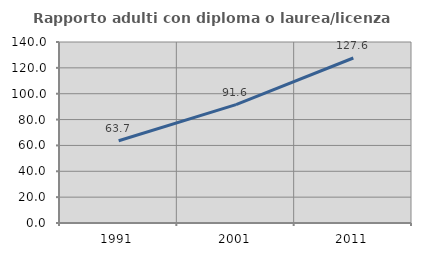
| Category | Rapporto adulti con diploma o laurea/licenza media  |
|---|---|
| 1991.0 | 63.659 |
| 2001.0 | 91.609 |
| 2011.0 | 127.613 |